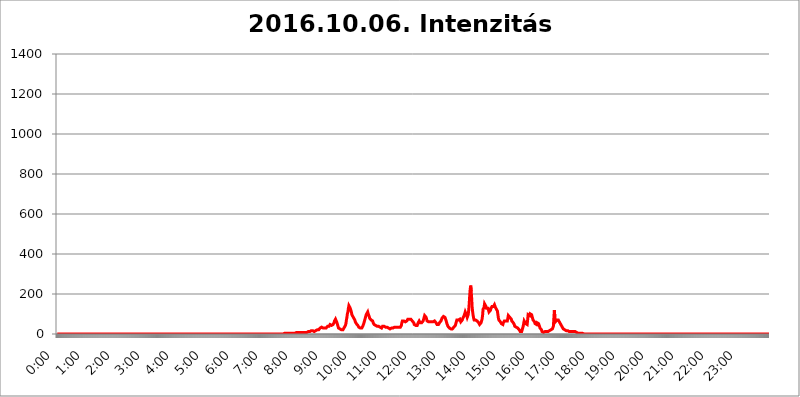
| Category | 2016.10.06. Intenzitás [W/m^2] |
|---|---|
| 0.0 | 0 |
| 0.0006944444444444445 | 0 |
| 0.001388888888888889 | 0 |
| 0.0020833333333333333 | 0 |
| 0.002777777777777778 | 0 |
| 0.003472222222222222 | 0 |
| 0.004166666666666667 | 0 |
| 0.004861111111111111 | 0 |
| 0.005555555555555556 | 0 |
| 0.0062499999999999995 | 0 |
| 0.006944444444444444 | 0 |
| 0.007638888888888889 | 0 |
| 0.008333333333333333 | 0 |
| 0.009027777777777779 | 0 |
| 0.009722222222222222 | 0 |
| 0.010416666666666666 | 0 |
| 0.011111111111111112 | 0 |
| 0.011805555555555555 | 0 |
| 0.012499999999999999 | 0 |
| 0.013194444444444444 | 0 |
| 0.013888888888888888 | 0 |
| 0.014583333333333332 | 0 |
| 0.015277777777777777 | 0 |
| 0.015972222222222224 | 0 |
| 0.016666666666666666 | 0 |
| 0.017361111111111112 | 0 |
| 0.018055555555555557 | 0 |
| 0.01875 | 0 |
| 0.019444444444444445 | 0 |
| 0.02013888888888889 | 0 |
| 0.020833333333333332 | 0 |
| 0.02152777777777778 | 0 |
| 0.022222222222222223 | 0 |
| 0.02291666666666667 | 0 |
| 0.02361111111111111 | 0 |
| 0.024305555555555556 | 0 |
| 0.024999999999999998 | 0 |
| 0.025694444444444447 | 0 |
| 0.02638888888888889 | 0 |
| 0.027083333333333334 | 0 |
| 0.027777777777777776 | 0 |
| 0.02847222222222222 | 0 |
| 0.029166666666666664 | 0 |
| 0.029861111111111113 | 0 |
| 0.030555555555555555 | 0 |
| 0.03125 | 0 |
| 0.03194444444444445 | 0 |
| 0.03263888888888889 | 0 |
| 0.03333333333333333 | 0 |
| 0.034027777777777775 | 0 |
| 0.034722222222222224 | 0 |
| 0.035416666666666666 | 0 |
| 0.036111111111111115 | 0 |
| 0.03680555555555556 | 0 |
| 0.0375 | 0 |
| 0.03819444444444444 | 0 |
| 0.03888888888888889 | 0 |
| 0.03958333333333333 | 0 |
| 0.04027777777777778 | 0 |
| 0.04097222222222222 | 0 |
| 0.041666666666666664 | 0 |
| 0.042361111111111106 | 0 |
| 0.04305555555555556 | 0 |
| 0.043750000000000004 | 0 |
| 0.044444444444444446 | 0 |
| 0.04513888888888889 | 0 |
| 0.04583333333333334 | 0 |
| 0.04652777777777778 | 0 |
| 0.04722222222222222 | 0 |
| 0.04791666666666666 | 0 |
| 0.04861111111111111 | 0 |
| 0.049305555555555554 | 0 |
| 0.049999999999999996 | 0 |
| 0.05069444444444445 | 0 |
| 0.051388888888888894 | 0 |
| 0.052083333333333336 | 0 |
| 0.05277777777777778 | 0 |
| 0.05347222222222222 | 0 |
| 0.05416666666666667 | 0 |
| 0.05486111111111111 | 0 |
| 0.05555555555555555 | 0 |
| 0.05625 | 0 |
| 0.05694444444444444 | 0 |
| 0.057638888888888885 | 0 |
| 0.05833333333333333 | 0 |
| 0.05902777777777778 | 0 |
| 0.059722222222222225 | 0 |
| 0.06041666666666667 | 0 |
| 0.061111111111111116 | 0 |
| 0.06180555555555556 | 0 |
| 0.0625 | 0 |
| 0.06319444444444444 | 0 |
| 0.06388888888888888 | 0 |
| 0.06458333333333334 | 0 |
| 0.06527777777777778 | 0 |
| 0.06597222222222222 | 0 |
| 0.06666666666666667 | 0 |
| 0.06736111111111111 | 0 |
| 0.06805555555555555 | 0 |
| 0.06874999999999999 | 0 |
| 0.06944444444444443 | 0 |
| 0.07013888888888889 | 0 |
| 0.07083333333333333 | 0 |
| 0.07152777777777779 | 0 |
| 0.07222222222222223 | 0 |
| 0.07291666666666667 | 0 |
| 0.07361111111111111 | 0 |
| 0.07430555555555556 | 0 |
| 0.075 | 0 |
| 0.07569444444444444 | 0 |
| 0.0763888888888889 | 0 |
| 0.07708333333333334 | 0 |
| 0.07777777777777778 | 0 |
| 0.07847222222222222 | 0 |
| 0.07916666666666666 | 0 |
| 0.0798611111111111 | 0 |
| 0.08055555555555556 | 0 |
| 0.08125 | 0 |
| 0.08194444444444444 | 0 |
| 0.08263888888888889 | 0 |
| 0.08333333333333333 | 0 |
| 0.08402777777777777 | 0 |
| 0.08472222222222221 | 0 |
| 0.08541666666666665 | 0 |
| 0.08611111111111112 | 0 |
| 0.08680555555555557 | 0 |
| 0.08750000000000001 | 0 |
| 0.08819444444444445 | 0 |
| 0.08888888888888889 | 0 |
| 0.08958333333333333 | 0 |
| 0.09027777777777778 | 0 |
| 0.09097222222222222 | 0 |
| 0.09166666666666667 | 0 |
| 0.09236111111111112 | 0 |
| 0.09305555555555556 | 0 |
| 0.09375 | 0 |
| 0.09444444444444444 | 0 |
| 0.09513888888888888 | 0 |
| 0.09583333333333333 | 0 |
| 0.09652777777777777 | 0 |
| 0.09722222222222222 | 0 |
| 0.09791666666666667 | 0 |
| 0.09861111111111111 | 0 |
| 0.09930555555555555 | 0 |
| 0.09999999999999999 | 0 |
| 0.10069444444444443 | 0 |
| 0.1013888888888889 | 0 |
| 0.10208333333333335 | 0 |
| 0.10277777777777779 | 0 |
| 0.10347222222222223 | 0 |
| 0.10416666666666667 | 0 |
| 0.10486111111111111 | 0 |
| 0.10555555555555556 | 0 |
| 0.10625 | 0 |
| 0.10694444444444444 | 0 |
| 0.1076388888888889 | 0 |
| 0.10833333333333334 | 0 |
| 0.10902777777777778 | 0 |
| 0.10972222222222222 | 0 |
| 0.1111111111111111 | 0 |
| 0.11180555555555556 | 0 |
| 0.11180555555555556 | 0 |
| 0.1125 | 0 |
| 0.11319444444444444 | 0 |
| 0.11388888888888889 | 0 |
| 0.11458333333333333 | 0 |
| 0.11527777777777777 | 0 |
| 0.11597222222222221 | 0 |
| 0.11666666666666665 | 0 |
| 0.1173611111111111 | 0 |
| 0.11805555555555557 | 0 |
| 0.11944444444444445 | 0 |
| 0.12013888888888889 | 0 |
| 0.12083333333333333 | 0 |
| 0.12152777777777778 | 0 |
| 0.12222222222222223 | 0 |
| 0.12291666666666667 | 0 |
| 0.12291666666666667 | 0 |
| 0.12361111111111112 | 0 |
| 0.12430555555555556 | 0 |
| 0.125 | 0 |
| 0.12569444444444444 | 0 |
| 0.12638888888888888 | 0 |
| 0.12708333333333333 | 0 |
| 0.16875 | 0 |
| 0.12847222222222224 | 0 |
| 0.12916666666666668 | 0 |
| 0.12986111111111112 | 0 |
| 0.13055555555555556 | 0 |
| 0.13125 | 0 |
| 0.13194444444444445 | 0 |
| 0.1326388888888889 | 0 |
| 0.13333333333333333 | 0 |
| 0.13402777777777777 | 0 |
| 0.13402777777777777 | 0 |
| 0.13472222222222222 | 0 |
| 0.13541666666666666 | 0 |
| 0.1361111111111111 | 0 |
| 0.13749999999999998 | 0 |
| 0.13819444444444443 | 0 |
| 0.1388888888888889 | 0 |
| 0.13958333333333334 | 0 |
| 0.14027777777777778 | 0 |
| 0.14097222222222222 | 0 |
| 0.14166666666666666 | 0 |
| 0.1423611111111111 | 0 |
| 0.14305555555555557 | 0 |
| 0.14375000000000002 | 0 |
| 0.14444444444444446 | 0 |
| 0.1451388888888889 | 0 |
| 0.1451388888888889 | 0 |
| 0.14652777777777778 | 0 |
| 0.14722222222222223 | 0 |
| 0.14791666666666667 | 0 |
| 0.1486111111111111 | 0 |
| 0.14930555555555555 | 0 |
| 0.15 | 0 |
| 0.15069444444444444 | 0 |
| 0.15138888888888888 | 0 |
| 0.15208333333333332 | 0 |
| 0.15277777777777776 | 0 |
| 0.15347222222222223 | 0 |
| 0.15416666666666667 | 0 |
| 0.15486111111111112 | 0 |
| 0.15555555555555556 | 0 |
| 0.15625 | 0 |
| 0.15694444444444444 | 0 |
| 0.15763888888888888 | 0 |
| 0.15833333333333333 | 0 |
| 0.15902777777777777 | 0 |
| 0.15972222222222224 | 0 |
| 0.16041666666666668 | 0 |
| 0.16111111111111112 | 0 |
| 0.16180555555555556 | 0 |
| 0.1625 | 0 |
| 0.16319444444444445 | 0 |
| 0.1638888888888889 | 0 |
| 0.16458333333333333 | 0 |
| 0.16527777777777777 | 0 |
| 0.16597222222222222 | 0 |
| 0.16666666666666666 | 0 |
| 0.1673611111111111 | 0 |
| 0.16805555555555554 | 0 |
| 0.16874999999999998 | 0 |
| 0.16944444444444443 | 0 |
| 0.17013888888888887 | 0 |
| 0.1708333333333333 | 0 |
| 0.17152777777777775 | 0 |
| 0.17222222222222225 | 0 |
| 0.1729166666666667 | 0 |
| 0.17361111111111113 | 0 |
| 0.17430555555555557 | 0 |
| 0.17500000000000002 | 0 |
| 0.17569444444444446 | 0 |
| 0.1763888888888889 | 0 |
| 0.17708333333333334 | 0 |
| 0.17777777777777778 | 0 |
| 0.17847222222222223 | 0 |
| 0.17916666666666667 | 0 |
| 0.1798611111111111 | 0 |
| 0.18055555555555555 | 0 |
| 0.18125 | 0 |
| 0.18194444444444444 | 0 |
| 0.1826388888888889 | 0 |
| 0.18333333333333335 | 0 |
| 0.1840277777777778 | 0 |
| 0.18472222222222223 | 0 |
| 0.18541666666666667 | 0 |
| 0.18611111111111112 | 0 |
| 0.18680555555555556 | 0 |
| 0.1875 | 0 |
| 0.18819444444444444 | 0 |
| 0.18888888888888888 | 0 |
| 0.18958333333333333 | 0 |
| 0.19027777777777777 | 0 |
| 0.1909722222222222 | 0 |
| 0.19166666666666665 | 0 |
| 0.19236111111111112 | 0 |
| 0.19305555555555554 | 0 |
| 0.19375 | 0 |
| 0.19444444444444445 | 0 |
| 0.1951388888888889 | 0 |
| 0.19583333333333333 | 0 |
| 0.19652777777777777 | 0 |
| 0.19722222222222222 | 0 |
| 0.19791666666666666 | 0 |
| 0.1986111111111111 | 0 |
| 0.19930555555555554 | 0 |
| 0.19999999999999998 | 0 |
| 0.20069444444444443 | 0 |
| 0.20138888888888887 | 0 |
| 0.2020833333333333 | 0 |
| 0.2027777777777778 | 0 |
| 0.2034722222222222 | 0 |
| 0.2041666666666667 | 0 |
| 0.20486111111111113 | 0 |
| 0.20555555555555557 | 0 |
| 0.20625000000000002 | 0 |
| 0.20694444444444446 | 0 |
| 0.2076388888888889 | 0 |
| 0.20833333333333334 | 0 |
| 0.20902777777777778 | 0 |
| 0.20972222222222223 | 0 |
| 0.21041666666666667 | 0 |
| 0.2111111111111111 | 0 |
| 0.21180555555555555 | 0 |
| 0.2125 | 0 |
| 0.21319444444444444 | 0 |
| 0.2138888888888889 | 0 |
| 0.21458333333333335 | 0 |
| 0.2152777777777778 | 0 |
| 0.21597222222222223 | 0 |
| 0.21666666666666667 | 0 |
| 0.21736111111111112 | 0 |
| 0.21805555555555556 | 0 |
| 0.21875 | 0 |
| 0.21944444444444444 | 0 |
| 0.22013888888888888 | 0 |
| 0.22083333333333333 | 0 |
| 0.22152777777777777 | 0 |
| 0.2222222222222222 | 0 |
| 0.22291666666666665 | 0 |
| 0.2236111111111111 | 0 |
| 0.22430555555555556 | 0 |
| 0.225 | 0 |
| 0.22569444444444445 | 0 |
| 0.2263888888888889 | 0 |
| 0.22708333333333333 | 0 |
| 0.22777777777777777 | 0 |
| 0.22847222222222222 | 0 |
| 0.22916666666666666 | 0 |
| 0.2298611111111111 | 0 |
| 0.23055555555555554 | 0 |
| 0.23124999999999998 | 0 |
| 0.23194444444444443 | 0 |
| 0.23263888888888887 | 0 |
| 0.2333333333333333 | 0 |
| 0.2340277777777778 | 0 |
| 0.2347222222222222 | 0 |
| 0.2354166666666667 | 0 |
| 0.23611111111111113 | 0 |
| 0.23680555555555557 | 0 |
| 0.23750000000000002 | 0 |
| 0.23819444444444446 | 0 |
| 0.2388888888888889 | 0 |
| 0.23958333333333334 | 0 |
| 0.24027777777777778 | 0 |
| 0.24097222222222223 | 0 |
| 0.24166666666666667 | 0 |
| 0.2423611111111111 | 0 |
| 0.24305555555555555 | 0 |
| 0.24375 | 0 |
| 0.24444444444444446 | 0 |
| 0.24513888888888888 | 0 |
| 0.24583333333333335 | 0 |
| 0.2465277777777778 | 0 |
| 0.24722222222222223 | 0 |
| 0.24791666666666667 | 0 |
| 0.24861111111111112 | 0 |
| 0.24930555555555556 | 0 |
| 0.25 | 0 |
| 0.25069444444444444 | 0 |
| 0.2513888888888889 | 0 |
| 0.2520833333333333 | 0 |
| 0.25277777777777777 | 0 |
| 0.2534722222222222 | 0 |
| 0.25416666666666665 | 0 |
| 0.2548611111111111 | 0 |
| 0.2555555555555556 | 0 |
| 0.25625000000000003 | 0 |
| 0.2569444444444445 | 0 |
| 0.2576388888888889 | 0 |
| 0.25833333333333336 | 0 |
| 0.2590277777777778 | 0 |
| 0.25972222222222224 | 0 |
| 0.2604166666666667 | 0 |
| 0.2611111111111111 | 0 |
| 0.26180555555555557 | 0 |
| 0.2625 | 0 |
| 0.26319444444444445 | 0 |
| 0.2638888888888889 | 0 |
| 0.26458333333333334 | 0 |
| 0.2652777777777778 | 0 |
| 0.2659722222222222 | 0 |
| 0.26666666666666666 | 0 |
| 0.2673611111111111 | 0 |
| 0.26805555555555555 | 0 |
| 0.26875 | 0 |
| 0.26944444444444443 | 0 |
| 0.2701388888888889 | 0 |
| 0.2708333333333333 | 0 |
| 0.27152777777777776 | 0 |
| 0.2722222222222222 | 0 |
| 0.27291666666666664 | 0 |
| 0.2736111111111111 | 0 |
| 0.2743055555555555 | 0 |
| 0.27499999999999997 | 0 |
| 0.27569444444444446 | 0 |
| 0.27638888888888885 | 0 |
| 0.27708333333333335 | 0 |
| 0.2777777777777778 | 0 |
| 0.27847222222222223 | 0 |
| 0.2791666666666667 | 0 |
| 0.2798611111111111 | 0 |
| 0.28055555555555556 | 0 |
| 0.28125 | 0 |
| 0.28194444444444444 | 0 |
| 0.2826388888888889 | 0 |
| 0.2833333333333333 | 0 |
| 0.28402777777777777 | 0 |
| 0.2847222222222222 | 0 |
| 0.28541666666666665 | 0 |
| 0.28611111111111115 | 0 |
| 0.28680555555555554 | 0 |
| 0.28750000000000003 | 0 |
| 0.2881944444444445 | 0 |
| 0.2888888888888889 | 0 |
| 0.28958333333333336 | 0 |
| 0.2902777777777778 | 0 |
| 0.29097222222222224 | 0 |
| 0.2916666666666667 | 0 |
| 0.2923611111111111 | 0 |
| 0.29305555555555557 | 0 |
| 0.29375 | 0 |
| 0.29444444444444445 | 0 |
| 0.2951388888888889 | 0 |
| 0.29583333333333334 | 0 |
| 0.2965277777777778 | 0 |
| 0.2972222222222222 | 0 |
| 0.29791666666666666 | 0 |
| 0.2986111111111111 | 0 |
| 0.29930555555555555 | 0 |
| 0.3 | 0 |
| 0.30069444444444443 | 0 |
| 0.3013888888888889 | 0 |
| 0.3020833333333333 | 0 |
| 0.30277777777777776 | 0 |
| 0.3034722222222222 | 0 |
| 0.30416666666666664 | 0 |
| 0.3048611111111111 | 0 |
| 0.3055555555555555 | 0 |
| 0.30624999999999997 | 0 |
| 0.3069444444444444 | 0 |
| 0.3076388888888889 | 0 |
| 0.30833333333333335 | 0 |
| 0.3090277777777778 | 3.525 |
| 0.30972222222222223 | 0 |
| 0.3104166666666667 | 0 |
| 0.3111111111111111 | 0 |
| 0.31180555555555556 | 0 |
| 0.3125 | 0 |
| 0.31319444444444444 | 0 |
| 0.3138888888888889 | 0 |
| 0.3145833333333333 | 0 |
| 0.31527777777777777 | 3.525 |
| 0.3159722222222222 | 3.525 |
| 0.31666666666666665 | 0 |
| 0.31736111111111115 | 3.525 |
| 0.31805555555555554 | 3.525 |
| 0.31875000000000003 | 3.525 |
| 0.3194444444444445 | 3.525 |
| 0.3201388888888889 | 3.525 |
| 0.32083333333333336 | 3.525 |
| 0.3215277777777778 | 3.525 |
| 0.32222222222222224 | 3.525 |
| 0.3229166666666667 | 3.525 |
| 0.3236111111111111 | 3.525 |
| 0.32430555555555557 | 3.525 |
| 0.325 | 3.525 |
| 0.32569444444444445 | 3.525 |
| 0.3263888888888889 | 3.525 |
| 0.32708333333333334 | 3.525 |
| 0.3277777777777778 | 3.525 |
| 0.3284722222222222 | 3.525 |
| 0.32916666666666666 | 3.525 |
| 0.3298611111111111 | 3.525 |
| 0.33055555555555555 | 3.525 |
| 0.33125 | 3.525 |
| 0.33194444444444443 | 3.525 |
| 0.3326388888888889 | 3.525 |
| 0.3333333333333333 | 3.525 |
| 0.3340277777777778 | 3.525 |
| 0.3347222222222222 | 7.887 |
| 0.3354166666666667 | 7.887 |
| 0.3361111111111111 | 7.887 |
| 0.3368055555555556 | 3.525 |
| 0.33749999999999997 | 7.887 |
| 0.33819444444444446 | 7.887 |
| 0.33888888888888885 | 7.887 |
| 0.33958333333333335 | 7.887 |
| 0.34027777777777773 | 7.887 |
| 0.34097222222222223 | 7.887 |
| 0.3416666666666666 | 7.887 |
| 0.3423611111111111 | 7.887 |
| 0.3430555555555555 | 7.887 |
| 0.34375 | 7.887 |
| 0.3444444444444445 | 7.887 |
| 0.3451388888888889 | 7.887 |
| 0.3458333333333334 | 7.887 |
| 0.34652777777777777 | 7.887 |
| 0.34722222222222227 | 7.887 |
| 0.34791666666666665 | 7.887 |
| 0.34861111111111115 | 7.887 |
| 0.34930555555555554 | 7.887 |
| 0.35000000000000003 | 7.887 |
| 0.3506944444444444 | 7.887 |
| 0.3513888888888889 | 12.257 |
| 0.3520833333333333 | 12.257 |
| 0.3527777777777778 | 12.257 |
| 0.3534722222222222 | 12.257 |
| 0.3541666666666667 | 12.257 |
| 0.3548611111111111 | 12.257 |
| 0.35555555555555557 | 16.636 |
| 0.35625 | 16.636 |
| 0.35694444444444445 | 16.636 |
| 0.3576388888888889 | 16.636 |
| 0.35833333333333334 | 16.636 |
| 0.3590277777777778 | 16.636 |
| 0.3597222222222222 | 12.257 |
| 0.36041666666666666 | 12.257 |
| 0.3611111111111111 | 12.257 |
| 0.36180555555555555 | 12.257 |
| 0.3625 | 16.636 |
| 0.36319444444444443 | 16.636 |
| 0.3638888888888889 | 21.024 |
| 0.3645833333333333 | 21.024 |
| 0.3652777777777778 | 21.024 |
| 0.3659722222222222 | 21.024 |
| 0.3666666666666667 | 21.024 |
| 0.3673611111111111 | 25.419 |
| 0.3680555555555556 | 25.419 |
| 0.36874999999999997 | 29.823 |
| 0.36944444444444446 | 29.823 |
| 0.37013888888888885 | 29.823 |
| 0.37083333333333335 | 34.234 |
| 0.37152777777777773 | 34.234 |
| 0.37222222222222223 | 29.823 |
| 0.3729166666666666 | 29.823 |
| 0.3736111111111111 | 25.419 |
| 0.3743055555555555 | 29.823 |
| 0.375 | 29.823 |
| 0.3756944444444445 | 29.823 |
| 0.3763888888888889 | 29.823 |
| 0.3770833333333334 | 29.823 |
| 0.37777777777777777 | 29.823 |
| 0.37847222222222227 | 34.234 |
| 0.37916666666666665 | 38.653 |
| 0.37986111111111115 | 38.653 |
| 0.38055555555555554 | 38.653 |
| 0.38125000000000003 | 38.653 |
| 0.3819444444444444 | 43.079 |
| 0.3826388888888889 | 47.511 |
| 0.3833333333333333 | 47.511 |
| 0.3840277777777778 | 47.511 |
| 0.3847222222222222 | 43.079 |
| 0.3854166666666667 | 43.079 |
| 0.3861111111111111 | 47.511 |
| 0.38680555555555557 | 47.511 |
| 0.3875 | 47.511 |
| 0.38819444444444445 | 56.398 |
| 0.3888888888888889 | 65.31 |
| 0.38958333333333334 | 69.775 |
| 0.3902777777777778 | 74.246 |
| 0.3909722222222222 | 74.246 |
| 0.39166666666666666 | 69.775 |
| 0.3923611111111111 | 56.398 |
| 0.39305555555555555 | 47.511 |
| 0.39375 | 38.653 |
| 0.39444444444444443 | 29.823 |
| 0.3951388888888889 | 29.823 |
| 0.3958333333333333 | 29.823 |
| 0.3965277777777778 | 25.419 |
| 0.3972222222222222 | 25.419 |
| 0.3979166666666667 | 25.419 |
| 0.3986111111111111 | 21.024 |
| 0.3993055555555556 | 21.024 |
| 0.39999999999999997 | 21.024 |
| 0.40069444444444446 | 21.024 |
| 0.40138888888888885 | 25.419 |
| 0.40208333333333335 | 29.823 |
| 0.40277777777777773 | 29.823 |
| 0.40347222222222223 | 34.234 |
| 0.4041666666666666 | 43.079 |
| 0.4048611111111111 | 51.951 |
| 0.4055555555555555 | 69.775 |
| 0.40625 | 83.205 |
| 0.4069444444444445 | 101.184 |
| 0.4076388888888889 | 110.201 |
| 0.4083333333333334 | 128.284 |
| 0.40902777777777777 | 141.884 |
| 0.40972222222222227 | 146.423 |
| 0.41041666666666665 | 132.814 |
| 0.41111111111111115 | 128.284 |
| 0.41180555555555554 | 119.235 |
| 0.41250000000000003 | 110.201 |
| 0.4131944444444444 | 96.682 |
| 0.4138888888888889 | 92.184 |
| 0.4145833333333333 | 87.692 |
| 0.4152777777777778 | 83.205 |
| 0.4159722222222222 | 78.722 |
| 0.4166666666666667 | 74.246 |
| 0.4173611111111111 | 69.775 |
| 0.41805555555555557 | 60.85 |
| 0.41875 | 56.398 |
| 0.41944444444444445 | 51.951 |
| 0.4201388888888889 | 51.951 |
| 0.42083333333333334 | 47.511 |
| 0.4215277777777778 | 43.079 |
| 0.4222222222222222 | 38.653 |
| 0.42291666666666666 | 34.234 |
| 0.4236111111111111 | 29.823 |
| 0.42430555555555555 | 29.823 |
| 0.425 | 29.823 |
| 0.42569444444444443 | 29.823 |
| 0.4263888888888889 | 29.823 |
| 0.4270833333333333 | 29.823 |
| 0.4277777777777778 | 29.823 |
| 0.4284722222222222 | 38.653 |
| 0.4291666666666667 | 43.079 |
| 0.4298611111111111 | 51.951 |
| 0.4305555555555556 | 60.85 |
| 0.43124999999999997 | 69.775 |
| 0.43194444444444446 | 78.722 |
| 0.43263888888888885 | 87.692 |
| 0.43333333333333335 | 96.682 |
| 0.43402777777777773 | 96.682 |
| 0.43472222222222223 | 101.184 |
| 0.4354166666666666 | 110.201 |
| 0.4361111111111111 | 101.184 |
| 0.4368055555555555 | 96.682 |
| 0.4375 | 87.692 |
| 0.4381944444444445 | 78.722 |
| 0.4388888888888889 | 74.246 |
| 0.4395833333333334 | 74.246 |
| 0.44027777777777777 | 69.775 |
| 0.44097222222222227 | 69.775 |
| 0.44166666666666665 | 65.31 |
| 0.44236111111111115 | 65.31 |
| 0.44305555555555554 | 56.398 |
| 0.44375000000000003 | 51.951 |
| 0.4444444444444444 | 47.511 |
| 0.4451388888888889 | 47.511 |
| 0.4458333333333333 | 47.511 |
| 0.4465277777777778 | 43.079 |
| 0.4472222222222222 | 38.653 |
| 0.4479166666666667 | 38.653 |
| 0.4486111111111111 | 38.653 |
| 0.44930555555555557 | 34.234 |
| 0.45 | 38.653 |
| 0.45069444444444445 | 38.653 |
| 0.4513888888888889 | 38.653 |
| 0.45208333333333334 | 34.234 |
| 0.4527777777777778 | 34.234 |
| 0.4534722222222222 | 29.823 |
| 0.45416666666666666 | 29.823 |
| 0.4548611111111111 | 29.823 |
| 0.45555555555555555 | 34.234 |
| 0.45625 | 38.653 |
| 0.45694444444444443 | 38.653 |
| 0.4576388888888889 | 43.079 |
| 0.4583333333333333 | 38.653 |
| 0.4590277777777778 | 38.653 |
| 0.4597222222222222 | 34.234 |
| 0.4604166666666667 | 34.234 |
| 0.4611111111111111 | 34.234 |
| 0.4618055555555556 | 34.234 |
| 0.46249999999999997 | 34.234 |
| 0.46319444444444446 | 29.823 |
| 0.46388888888888885 | 29.823 |
| 0.46458333333333335 | 29.823 |
| 0.46527777777777773 | 25.419 |
| 0.46597222222222223 | 25.419 |
| 0.4666666666666666 | 25.419 |
| 0.4673611111111111 | 25.419 |
| 0.4680555555555555 | 29.823 |
| 0.46875 | 29.823 |
| 0.4694444444444445 | 29.823 |
| 0.4701388888888889 | 29.823 |
| 0.4708333333333334 | 29.823 |
| 0.47152777777777777 | 34.234 |
| 0.47222222222222227 | 34.234 |
| 0.47291666666666665 | 34.234 |
| 0.47361111111111115 | 34.234 |
| 0.47430555555555554 | 34.234 |
| 0.47500000000000003 | 34.234 |
| 0.4756944444444444 | 34.234 |
| 0.4763888888888889 | 34.234 |
| 0.4770833333333333 | 34.234 |
| 0.4777777777777778 | 34.234 |
| 0.4784722222222222 | 34.234 |
| 0.4791666666666667 | 34.234 |
| 0.4798611111111111 | 34.234 |
| 0.48055555555555557 | 34.234 |
| 0.48125 | 34.234 |
| 0.48194444444444445 | 38.653 |
| 0.4826388888888889 | 43.079 |
| 0.48333333333333334 | 56.398 |
| 0.4840277777777778 | 65.31 |
| 0.4847222222222222 | 69.775 |
| 0.48541666666666666 | 69.775 |
| 0.4861111111111111 | 65.31 |
| 0.48680555555555555 | 60.85 |
| 0.4875 | 60.85 |
| 0.48819444444444443 | 60.85 |
| 0.4888888888888889 | 60.85 |
| 0.4895833333333333 | 60.85 |
| 0.4902777777777778 | 65.31 |
| 0.4909722222222222 | 69.775 |
| 0.4916666666666667 | 74.246 |
| 0.4923611111111111 | 74.246 |
| 0.4930555555555556 | 74.246 |
| 0.49374999999999997 | 74.246 |
| 0.49444444444444446 | 78.722 |
| 0.49513888888888885 | 74.246 |
| 0.49583333333333335 | 74.246 |
| 0.49652777777777773 | 69.775 |
| 0.49722222222222223 | 69.775 |
| 0.4979166666666666 | 65.31 |
| 0.4986111111111111 | 65.31 |
| 0.4993055555555555 | 60.85 |
| 0.5 | 56.398 |
| 0.5006944444444444 | 47.511 |
| 0.5013888888888889 | 43.079 |
| 0.5020833333333333 | 43.079 |
| 0.5027777777777778 | 43.079 |
| 0.5034722222222222 | 38.653 |
| 0.5041666666666667 | 38.653 |
| 0.5048611111111111 | 43.079 |
| 0.5055555555555555 | 47.511 |
| 0.50625 | 56.398 |
| 0.5069444444444444 | 60.85 |
| 0.5076388888888889 | 65.31 |
| 0.5083333333333333 | 60.85 |
| 0.5090277777777777 | 56.398 |
| 0.5097222222222222 | 51.951 |
| 0.5104166666666666 | 51.951 |
| 0.5111111111111112 | 56.398 |
| 0.5118055555555555 | 56.398 |
| 0.5125000000000001 | 60.85 |
| 0.5131944444444444 | 65.31 |
| 0.513888888888889 | 74.246 |
| 0.5145833333333333 | 83.205 |
| 0.5152777777777778 | 92.184 |
| 0.5159722222222222 | 92.184 |
| 0.5166666666666667 | 87.692 |
| 0.517361111111111 | 83.205 |
| 0.5180555555555556 | 74.246 |
| 0.5187499999999999 | 65.31 |
| 0.5194444444444445 | 60.85 |
| 0.5201388888888888 | 60.85 |
| 0.5208333333333334 | 60.85 |
| 0.5215277777777778 | 60.85 |
| 0.5222222222222223 | 60.85 |
| 0.5229166666666667 | 60.85 |
| 0.5236111111111111 | 60.85 |
| 0.5243055555555556 | 60.85 |
| 0.525 | 60.85 |
| 0.5256944444444445 | 60.85 |
| 0.5263888888888889 | 60.85 |
| 0.5270833333333333 | 60.85 |
| 0.5277777777777778 | 60.85 |
| 0.5284722222222222 | 65.31 |
| 0.5291666666666667 | 65.31 |
| 0.5298611111111111 | 65.31 |
| 0.5305555555555556 | 60.85 |
| 0.53125 | 56.398 |
| 0.5319444444444444 | 56.398 |
| 0.5326388888888889 | 47.511 |
| 0.5333333333333333 | 43.079 |
| 0.5340277777777778 | 43.079 |
| 0.5347222222222222 | 47.511 |
| 0.5354166666666667 | 51.951 |
| 0.5361111111111111 | 56.398 |
| 0.5368055555555555 | 56.398 |
| 0.5375 | 56.398 |
| 0.5381944444444444 | 65.31 |
| 0.5388888888888889 | 69.775 |
| 0.5395833333333333 | 78.722 |
| 0.5402777777777777 | 83.205 |
| 0.5409722222222222 | 83.205 |
| 0.5416666666666666 | 87.692 |
| 0.5423611111111112 | 92.184 |
| 0.5430555555555555 | 87.692 |
| 0.5437500000000001 | 83.205 |
| 0.5444444444444444 | 78.722 |
| 0.545138888888889 | 69.775 |
| 0.5458333333333333 | 60.85 |
| 0.5465277777777778 | 51.951 |
| 0.5472222222222222 | 47.511 |
| 0.5479166666666667 | 38.653 |
| 0.548611111111111 | 34.234 |
| 0.5493055555555556 | 34.234 |
| 0.5499999999999999 | 29.823 |
| 0.5506944444444445 | 25.419 |
| 0.5513888888888888 | 25.419 |
| 0.5520833333333334 | 25.419 |
| 0.5527777777777778 | 25.419 |
| 0.5534722222222223 | 25.419 |
| 0.5541666666666667 | 25.419 |
| 0.5548611111111111 | 25.419 |
| 0.5555555555555556 | 29.823 |
| 0.55625 | 34.234 |
| 0.5569444444444445 | 38.653 |
| 0.5576388888888889 | 38.653 |
| 0.5583333333333333 | 43.079 |
| 0.5590277777777778 | 51.951 |
| 0.5597222222222222 | 60.85 |
| 0.5604166666666667 | 69.775 |
| 0.5611111111111111 | 65.31 |
| 0.5618055555555556 | 65.31 |
| 0.5625 | 69.775 |
| 0.5631944444444444 | 74.246 |
| 0.5638888888888889 | 74.246 |
| 0.5645833333333333 | 74.246 |
| 0.5652777777777778 | 69.775 |
| 0.5659722222222222 | 60.85 |
| 0.5666666666666667 | 56.398 |
| 0.5673611111111111 | 60.85 |
| 0.5680555555555555 | 69.775 |
| 0.56875 | 78.722 |
| 0.5694444444444444 | 83.205 |
| 0.5701388888888889 | 87.692 |
| 0.5708333333333333 | 92.184 |
| 0.5715277777777777 | 101.184 |
| 0.5722222222222222 | 110.201 |
| 0.5729166666666666 | 114.716 |
| 0.5736111111111112 | 105.69 |
| 0.5743055555555555 | 92.184 |
| 0.5750000000000001 | 83.205 |
| 0.5756944444444444 | 83.205 |
| 0.576388888888889 | 96.682 |
| 0.5770833333333333 | 119.235 |
| 0.5777777777777778 | 150.964 |
| 0.5784722222222222 | 191.937 |
| 0.5791666666666667 | 223.873 |
| 0.579861111111111 | 242.127 |
| 0.5805555555555556 | 214.746 |
| 0.5812499999999999 | 178.264 |
| 0.5819444444444445 | 132.814 |
| 0.5826388888888888 | 110.201 |
| 0.5833333333333334 | 92.184 |
| 0.5840277777777778 | 78.722 |
| 0.5847222222222223 | 69.775 |
| 0.5854166666666667 | 65.31 |
| 0.5861111111111111 | 65.31 |
| 0.5868055555555556 | 69.775 |
| 0.5875 | 69.775 |
| 0.5881944444444445 | 69.775 |
| 0.5888888888888889 | 65.31 |
| 0.5895833333333333 | 65.31 |
| 0.5902777777777778 | 60.85 |
| 0.5909722222222222 | 56.398 |
| 0.5916666666666667 | 51.951 |
| 0.5923611111111111 | 47.511 |
| 0.5930555555555556 | 47.511 |
| 0.59375 | 51.951 |
| 0.5944444444444444 | 56.398 |
| 0.5951388888888889 | 65.31 |
| 0.5958333333333333 | 74.246 |
| 0.5965277777777778 | 92.184 |
| 0.5972222222222222 | 123.758 |
| 0.5979166666666667 | 119.235 |
| 0.5986111111111111 | 132.814 |
| 0.5993055555555555 | 150.964 |
| 0.6 | 155.509 |
| 0.6006944444444444 | 146.423 |
| 0.6013888888888889 | 137.347 |
| 0.6020833333333333 | 128.284 |
| 0.6027777777777777 | 123.758 |
| 0.6034722222222222 | 123.758 |
| 0.6041666666666666 | 128.284 |
| 0.6048611111111112 | 119.235 |
| 0.6055555555555555 | 110.201 |
| 0.6062500000000001 | 110.201 |
| 0.6069444444444444 | 114.716 |
| 0.607638888888889 | 119.235 |
| 0.6083333333333333 | 128.284 |
| 0.6090277777777778 | 132.814 |
| 0.6097222222222222 | 137.347 |
| 0.6104166666666667 | 137.347 |
| 0.611111111111111 | 132.814 |
| 0.6118055555555556 | 137.347 |
| 0.6124999999999999 | 141.884 |
| 0.6131944444444445 | 146.423 |
| 0.6138888888888888 | 141.884 |
| 0.6145833333333334 | 132.814 |
| 0.6152777777777778 | 128.284 |
| 0.6159722222222223 | 123.758 |
| 0.6166666666666667 | 119.235 |
| 0.6173611111111111 | 114.716 |
| 0.6180555555555556 | 96.682 |
| 0.61875 | 78.722 |
| 0.6194444444444445 | 69.775 |
| 0.6201388888888889 | 65.31 |
| 0.6208333333333333 | 65.31 |
| 0.6215277777777778 | 60.85 |
| 0.6222222222222222 | 56.398 |
| 0.6229166666666667 | 51.951 |
| 0.6236111111111111 | 47.511 |
| 0.6243055555555556 | 47.511 |
| 0.625 | 47.511 |
| 0.6256944444444444 | 56.398 |
| 0.6263888888888889 | 60.85 |
| 0.6270833333333333 | 65.31 |
| 0.6277777777777778 | 65.31 |
| 0.6284722222222222 | 65.31 |
| 0.6291666666666667 | 65.31 |
| 0.6298611111111111 | 60.85 |
| 0.6305555555555555 | 60.85 |
| 0.63125 | 65.31 |
| 0.6319444444444444 | 78.722 |
| 0.6326388888888889 | 92.184 |
| 0.6333333333333333 | 96.682 |
| 0.6340277777777777 | 92.184 |
| 0.6347222222222222 | 83.205 |
| 0.6354166666666666 | 83.205 |
| 0.6361111111111112 | 78.722 |
| 0.6368055555555555 | 74.246 |
| 0.6375000000000001 | 65.31 |
| 0.6381944444444444 | 65.31 |
| 0.638888888888889 | 60.85 |
| 0.6395833333333333 | 56.398 |
| 0.6402777777777778 | 51.951 |
| 0.6409722222222222 | 47.511 |
| 0.6416666666666667 | 38.653 |
| 0.642361111111111 | 34.234 |
| 0.6430555555555556 | 34.234 |
| 0.6437499999999999 | 34.234 |
| 0.6444444444444445 | 29.823 |
| 0.6451388888888888 | 29.823 |
| 0.6458333333333334 | 29.823 |
| 0.6465277777777778 | 25.419 |
| 0.6472222222222223 | 25.419 |
| 0.6479166666666667 | 21.024 |
| 0.6486111111111111 | 16.636 |
| 0.6493055555555556 | 12.257 |
| 0.65 | 12.257 |
| 0.6506944444444445 | 12.257 |
| 0.6513888888888889 | 12.257 |
| 0.6520833333333333 | 21.024 |
| 0.6527777777777778 | 29.823 |
| 0.6534722222222222 | 38.653 |
| 0.6541666666666667 | 51.951 |
| 0.6548611111111111 | 65.31 |
| 0.6555555555555556 | 65.31 |
| 0.65625 | 60.85 |
| 0.6569444444444444 | 51.951 |
| 0.6576388888888889 | 47.511 |
| 0.6583333333333333 | 47.511 |
| 0.6590277777777778 | 47.511 |
| 0.6597222222222222 | 69.775 |
| 0.6604166666666667 | 96.682 |
| 0.6611111111111111 | 96.682 |
| 0.6618055555555555 | 92.184 |
| 0.6625 | 92.184 |
| 0.6631944444444444 | 101.184 |
| 0.6638888888888889 | 101.184 |
| 0.6645833333333333 | 101.184 |
| 0.6652777777777777 | 96.682 |
| 0.6659722222222222 | 87.692 |
| 0.6666666666666666 | 78.722 |
| 0.6673611111111111 | 69.775 |
| 0.6680555555555556 | 69.775 |
| 0.6687500000000001 | 65.31 |
| 0.6694444444444444 | 60.85 |
| 0.6701388888888888 | 51.951 |
| 0.6708333333333334 | 47.511 |
| 0.6715277777777778 | 47.511 |
| 0.6722222222222222 | 47.511 |
| 0.6729166666666666 | 56.398 |
| 0.6736111111111112 | 56.398 |
| 0.6743055555555556 | 56.398 |
| 0.6749999999999999 | 51.951 |
| 0.6756944444444444 | 47.511 |
| 0.6763888888888889 | 38.653 |
| 0.6770833333333334 | 29.823 |
| 0.6777777777777777 | 29.823 |
| 0.6784722222222223 | 25.419 |
| 0.6791666666666667 | 21.024 |
| 0.6798611111111111 | 12.257 |
| 0.6805555555555555 | 12.257 |
| 0.68125 | 7.887 |
| 0.6819444444444445 | 7.887 |
| 0.6826388888888889 | 7.887 |
| 0.6833333333333332 | 12.257 |
| 0.6840277777777778 | 12.257 |
| 0.6847222222222222 | 12.257 |
| 0.6854166666666667 | 12.257 |
| 0.686111111111111 | 12.257 |
| 0.6868055555555556 | 12.257 |
| 0.6875 | 12.257 |
| 0.6881944444444444 | 12.257 |
| 0.688888888888889 | 12.257 |
| 0.6895833333333333 | 12.257 |
| 0.6902777777777778 | 16.636 |
| 0.6909722222222222 | 16.636 |
| 0.6916666666666668 | 16.636 |
| 0.6923611111111111 | 21.024 |
| 0.6930555555555555 | 21.024 |
| 0.69375 | 25.419 |
| 0.6944444444444445 | 25.419 |
| 0.6951388888888889 | 29.823 |
| 0.6958333333333333 | 38.653 |
| 0.6965277777777777 | 78.722 |
| 0.6972222222222223 | 119.235 |
| 0.6979166666666666 | 83.205 |
| 0.6986111111111111 | 60.85 |
| 0.6993055555555556 | 60.85 |
| 0.7000000000000001 | 65.31 |
| 0.7006944444444444 | 69.775 |
| 0.7013888888888888 | 69.775 |
| 0.7020833333333334 | 69.775 |
| 0.7027777777777778 | 69.775 |
| 0.7034722222222222 | 65.31 |
| 0.7041666666666666 | 60.85 |
| 0.7048611111111112 | 56.398 |
| 0.7055555555555556 | 51.951 |
| 0.7062499999999999 | 47.511 |
| 0.7069444444444444 | 43.079 |
| 0.7076388888888889 | 38.653 |
| 0.7083333333333334 | 34.234 |
| 0.7090277777777777 | 29.823 |
| 0.7097222222222223 | 25.419 |
| 0.7104166666666667 | 21.024 |
| 0.7111111111111111 | 21.024 |
| 0.7118055555555555 | 21.024 |
| 0.7125 | 16.636 |
| 0.7131944444444445 | 16.636 |
| 0.7138888888888889 | 16.636 |
| 0.7145833333333332 | 21.024 |
| 0.7152777777777778 | 16.636 |
| 0.7159722222222222 | 16.636 |
| 0.7166666666666667 | 16.636 |
| 0.717361111111111 | 16.636 |
| 0.7180555555555556 | 12.257 |
| 0.71875 | 12.257 |
| 0.7194444444444444 | 12.257 |
| 0.720138888888889 | 12.257 |
| 0.7208333333333333 | 12.257 |
| 0.7215277777777778 | 12.257 |
| 0.7222222222222222 | 12.257 |
| 0.7229166666666668 | 12.257 |
| 0.7236111111111111 | 12.257 |
| 0.7243055555555555 | 12.257 |
| 0.725 | 12.257 |
| 0.7256944444444445 | 12.257 |
| 0.7263888888888889 | 12.257 |
| 0.7270833333333333 | 12.257 |
| 0.7277777777777777 | 7.887 |
| 0.7284722222222223 | 7.887 |
| 0.7291666666666666 | 7.887 |
| 0.7298611111111111 | 7.887 |
| 0.7305555555555556 | 3.525 |
| 0.7312500000000001 | 3.525 |
| 0.7319444444444444 | 3.525 |
| 0.7326388888888888 | 3.525 |
| 0.7333333333333334 | 3.525 |
| 0.7340277777777778 | 3.525 |
| 0.7347222222222222 | 3.525 |
| 0.7354166666666666 | 3.525 |
| 0.7361111111111112 | 3.525 |
| 0.7368055555555556 | 3.525 |
| 0.7374999999999999 | 3.525 |
| 0.7381944444444444 | 3.525 |
| 0.7388888888888889 | 0 |
| 0.7395833333333334 | 0 |
| 0.7402777777777777 | 0 |
| 0.7409722222222223 | 0 |
| 0.7416666666666667 | 0 |
| 0.7423611111111111 | 0 |
| 0.7430555555555555 | 0 |
| 0.74375 | 0 |
| 0.7444444444444445 | 0 |
| 0.7451388888888889 | 0 |
| 0.7458333333333332 | 0 |
| 0.7465277777777778 | 0 |
| 0.7472222222222222 | 0 |
| 0.7479166666666667 | 0 |
| 0.748611111111111 | 0 |
| 0.7493055555555556 | 0 |
| 0.75 | 0 |
| 0.7506944444444444 | 0 |
| 0.751388888888889 | 0 |
| 0.7520833333333333 | 0 |
| 0.7527777777777778 | 0 |
| 0.7534722222222222 | 0 |
| 0.7541666666666668 | 0 |
| 0.7548611111111111 | 0 |
| 0.7555555555555555 | 0 |
| 0.75625 | 0 |
| 0.7569444444444445 | 0 |
| 0.7576388888888889 | 0 |
| 0.7583333333333333 | 0 |
| 0.7590277777777777 | 0 |
| 0.7597222222222223 | 0 |
| 0.7604166666666666 | 0 |
| 0.7611111111111111 | 0 |
| 0.7618055555555556 | 0 |
| 0.7625000000000001 | 0 |
| 0.7631944444444444 | 0 |
| 0.7638888888888888 | 0 |
| 0.7645833333333334 | 0 |
| 0.7652777777777778 | 0 |
| 0.7659722222222222 | 0 |
| 0.7666666666666666 | 0 |
| 0.7673611111111112 | 0 |
| 0.7680555555555556 | 0 |
| 0.7687499999999999 | 0 |
| 0.7694444444444444 | 0 |
| 0.7701388888888889 | 0 |
| 0.7708333333333334 | 0 |
| 0.7715277777777777 | 0 |
| 0.7722222222222223 | 0 |
| 0.7729166666666667 | 0 |
| 0.7736111111111111 | 0 |
| 0.7743055555555555 | 0 |
| 0.775 | 0 |
| 0.7756944444444445 | 0 |
| 0.7763888888888889 | 0 |
| 0.7770833333333332 | 0 |
| 0.7777777777777778 | 0 |
| 0.7784722222222222 | 0 |
| 0.7791666666666667 | 0 |
| 0.779861111111111 | 0 |
| 0.7805555555555556 | 0 |
| 0.78125 | 0 |
| 0.7819444444444444 | 0 |
| 0.782638888888889 | 0 |
| 0.7833333333333333 | 0 |
| 0.7840277777777778 | 0 |
| 0.7847222222222222 | 0 |
| 0.7854166666666668 | 0 |
| 0.7861111111111111 | 0 |
| 0.7868055555555555 | 0 |
| 0.7875 | 0 |
| 0.7881944444444445 | 0 |
| 0.7888888888888889 | 0 |
| 0.7895833333333333 | 0 |
| 0.7902777777777777 | 0 |
| 0.7909722222222223 | 0 |
| 0.7916666666666666 | 0 |
| 0.7923611111111111 | 0 |
| 0.7930555555555556 | 0 |
| 0.7937500000000001 | 0 |
| 0.7944444444444444 | 0 |
| 0.7951388888888888 | 0 |
| 0.7958333333333334 | 0 |
| 0.7965277777777778 | 0 |
| 0.7972222222222222 | 0 |
| 0.7979166666666666 | 0 |
| 0.7986111111111112 | 0 |
| 0.7993055555555556 | 0 |
| 0.7999999999999999 | 0 |
| 0.8006944444444444 | 0 |
| 0.8013888888888889 | 0 |
| 0.8020833333333334 | 0 |
| 0.8027777777777777 | 0 |
| 0.8034722222222223 | 0 |
| 0.8041666666666667 | 0 |
| 0.8048611111111111 | 0 |
| 0.8055555555555555 | 0 |
| 0.80625 | 0 |
| 0.8069444444444445 | 0 |
| 0.8076388888888889 | 0 |
| 0.8083333333333332 | 0 |
| 0.8090277777777778 | 0 |
| 0.8097222222222222 | 0 |
| 0.8104166666666667 | 0 |
| 0.811111111111111 | 0 |
| 0.8118055555555556 | 0 |
| 0.8125 | 0 |
| 0.8131944444444444 | 0 |
| 0.813888888888889 | 0 |
| 0.8145833333333333 | 0 |
| 0.8152777777777778 | 0 |
| 0.8159722222222222 | 0 |
| 0.8166666666666668 | 0 |
| 0.8173611111111111 | 0 |
| 0.8180555555555555 | 0 |
| 0.81875 | 0 |
| 0.8194444444444445 | 0 |
| 0.8201388888888889 | 0 |
| 0.8208333333333333 | 0 |
| 0.8215277777777777 | 0 |
| 0.8222222222222223 | 0 |
| 0.8229166666666666 | 0 |
| 0.8236111111111111 | 0 |
| 0.8243055555555556 | 0 |
| 0.8250000000000001 | 0 |
| 0.8256944444444444 | 0 |
| 0.8263888888888888 | 0 |
| 0.8270833333333334 | 0 |
| 0.8277777777777778 | 0 |
| 0.8284722222222222 | 0 |
| 0.8291666666666666 | 0 |
| 0.8298611111111112 | 0 |
| 0.8305555555555556 | 0 |
| 0.8312499999999999 | 0 |
| 0.8319444444444444 | 0 |
| 0.8326388888888889 | 0 |
| 0.8333333333333334 | 0 |
| 0.8340277777777777 | 0 |
| 0.8347222222222223 | 0 |
| 0.8354166666666667 | 0 |
| 0.8361111111111111 | 0 |
| 0.8368055555555555 | 0 |
| 0.8375 | 0 |
| 0.8381944444444445 | 0 |
| 0.8388888888888889 | 0 |
| 0.8395833333333332 | 0 |
| 0.8402777777777778 | 0 |
| 0.8409722222222222 | 0 |
| 0.8416666666666667 | 0 |
| 0.842361111111111 | 0 |
| 0.8430555555555556 | 0 |
| 0.84375 | 0 |
| 0.8444444444444444 | 0 |
| 0.845138888888889 | 0 |
| 0.8458333333333333 | 0 |
| 0.8465277777777778 | 0 |
| 0.8472222222222222 | 0 |
| 0.8479166666666668 | 0 |
| 0.8486111111111111 | 0 |
| 0.8493055555555555 | 0 |
| 0.85 | 0 |
| 0.8506944444444445 | 0 |
| 0.8513888888888889 | 0 |
| 0.8520833333333333 | 0 |
| 0.8527777777777777 | 0 |
| 0.8534722222222223 | 0 |
| 0.8541666666666666 | 0 |
| 0.8548611111111111 | 0 |
| 0.8555555555555556 | 0 |
| 0.8562500000000001 | 0 |
| 0.8569444444444444 | 0 |
| 0.8576388888888888 | 0 |
| 0.8583333333333334 | 0 |
| 0.8590277777777778 | 0 |
| 0.8597222222222222 | 0 |
| 0.8604166666666666 | 0 |
| 0.8611111111111112 | 0 |
| 0.8618055555555556 | 0 |
| 0.8624999999999999 | 0 |
| 0.8631944444444444 | 0 |
| 0.8638888888888889 | 0 |
| 0.8645833333333334 | 0 |
| 0.8652777777777777 | 0 |
| 0.8659722222222223 | 0 |
| 0.8666666666666667 | 0 |
| 0.8673611111111111 | 0 |
| 0.8680555555555555 | 0 |
| 0.86875 | 0 |
| 0.8694444444444445 | 0 |
| 0.8701388888888889 | 0 |
| 0.8708333333333332 | 0 |
| 0.8715277777777778 | 0 |
| 0.8722222222222222 | 0 |
| 0.8729166666666667 | 0 |
| 0.873611111111111 | 0 |
| 0.8743055555555556 | 0 |
| 0.875 | 0 |
| 0.8756944444444444 | 0 |
| 0.876388888888889 | 0 |
| 0.8770833333333333 | 0 |
| 0.8777777777777778 | 0 |
| 0.8784722222222222 | 0 |
| 0.8791666666666668 | 0 |
| 0.8798611111111111 | 0 |
| 0.8805555555555555 | 0 |
| 0.88125 | 0 |
| 0.8819444444444445 | 0 |
| 0.8826388888888889 | 0 |
| 0.8833333333333333 | 0 |
| 0.8840277777777777 | 0 |
| 0.8847222222222223 | 0 |
| 0.8854166666666666 | 0 |
| 0.8861111111111111 | 0 |
| 0.8868055555555556 | 0 |
| 0.8875000000000001 | 0 |
| 0.8881944444444444 | 0 |
| 0.8888888888888888 | 0 |
| 0.8895833333333334 | 0 |
| 0.8902777777777778 | 0 |
| 0.8909722222222222 | 0 |
| 0.8916666666666666 | 0 |
| 0.8923611111111112 | 0 |
| 0.8930555555555556 | 0 |
| 0.8937499999999999 | 0 |
| 0.8944444444444444 | 0 |
| 0.8951388888888889 | 0 |
| 0.8958333333333334 | 0 |
| 0.8965277777777777 | 0 |
| 0.8972222222222223 | 0 |
| 0.8979166666666667 | 0 |
| 0.8986111111111111 | 0 |
| 0.8993055555555555 | 0 |
| 0.9 | 0 |
| 0.9006944444444445 | 0 |
| 0.9013888888888889 | 0 |
| 0.9020833333333332 | 0 |
| 0.9027777777777778 | 0 |
| 0.9034722222222222 | 0 |
| 0.9041666666666667 | 0 |
| 0.904861111111111 | 0 |
| 0.9055555555555556 | 0 |
| 0.90625 | 0 |
| 0.9069444444444444 | 0 |
| 0.907638888888889 | 0 |
| 0.9083333333333333 | 0 |
| 0.9090277777777778 | 0 |
| 0.9097222222222222 | 0 |
| 0.9104166666666668 | 0 |
| 0.9111111111111111 | 0 |
| 0.9118055555555555 | 0 |
| 0.9125 | 0 |
| 0.9131944444444445 | 0 |
| 0.9138888888888889 | 0 |
| 0.9145833333333333 | 0 |
| 0.9152777777777777 | 0 |
| 0.9159722222222223 | 0 |
| 0.9166666666666666 | 0 |
| 0.9173611111111111 | 0 |
| 0.9180555555555556 | 0 |
| 0.9187500000000001 | 0 |
| 0.9194444444444444 | 0 |
| 0.9201388888888888 | 0 |
| 0.9208333333333334 | 0 |
| 0.9215277777777778 | 0 |
| 0.9222222222222222 | 0 |
| 0.9229166666666666 | 0 |
| 0.9236111111111112 | 0 |
| 0.9243055555555556 | 0 |
| 0.9249999999999999 | 0 |
| 0.9256944444444444 | 0 |
| 0.9263888888888889 | 0 |
| 0.9270833333333334 | 0 |
| 0.9277777777777777 | 0 |
| 0.9284722222222223 | 0 |
| 0.9291666666666667 | 0 |
| 0.9298611111111111 | 0 |
| 0.9305555555555555 | 0 |
| 0.93125 | 0 |
| 0.9319444444444445 | 0 |
| 0.9326388888888889 | 0 |
| 0.9333333333333332 | 0 |
| 0.9340277777777778 | 0 |
| 0.9347222222222222 | 0 |
| 0.9354166666666667 | 0 |
| 0.936111111111111 | 0 |
| 0.9368055555555556 | 0 |
| 0.9375 | 0 |
| 0.9381944444444444 | 0 |
| 0.938888888888889 | 0 |
| 0.9395833333333333 | 0 |
| 0.9402777777777778 | 0 |
| 0.9409722222222222 | 0 |
| 0.9416666666666668 | 0 |
| 0.9423611111111111 | 0 |
| 0.9430555555555555 | 0 |
| 0.94375 | 0 |
| 0.9444444444444445 | 0 |
| 0.9451388888888889 | 0 |
| 0.9458333333333333 | 0 |
| 0.9465277777777777 | 0 |
| 0.9472222222222223 | 0 |
| 0.9479166666666666 | 0 |
| 0.9486111111111111 | 0 |
| 0.9493055555555556 | 0 |
| 0.9500000000000001 | 0 |
| 0.9506944444444444 | 0 |
| 0.9513888888888888 | 0 |
| 0.9520833333333334 | 0 |
| 0.9527777777777778 | 0 |
| 0.9534722222222222 | 0 |
| 0.9541666666666666 | 0 |
| 0.9548611111111112 | 0 |
| 0.9555555555555556 | 0 |
| 0.9562499999999999 | 0 |
| 0.9569444444444444 | 0 |
| 0.9576388888888889 | 0 |
| 0.9583333333333334 | 0 |
| 0.9590277777777777 | 0 |
| 0.9597222222222223 | 0 |
| 0.9604166666666667 | 0 |
| 0.9611111111111111 | 0 |
| 0.9618055555555555 | 0 |
| 0.9625 | 0 |
| 0.9631944444444445 | 0 |
| 0.9638888888888889 | 0 |
| 0.9645833333333332 | 0 |
| 0.9652777777777778 | 0 |
| 0.9659722222222222 | 0 |
| 0.9666666666666667 | 0 |
| 0.967361111111111 | 0 |
| 0.9680555555555556 | 0 |
| 0.96875 | 0 |
| 0.9694444444444444 | 0 |
| 0.970138888888889 | 0 |
| 0.9708333333333333 | 0 |
| 0.9715277777777778 | 0 |
| 0.9722222222222222 | 0 |
| 0.9729166666666668 | 0 |
| 0.9736111111111111 | 0 |
| 0.9743055555555555 | 0 |
| 0.975 | 0 |
| 0.9756944444444445 | 0 |
| 0.9763888888888889 | 0 |
| 0.9770833333333333 | 0 |
| 0.9777777777777777 | 0 |
| 0.9784722222222223 | 0 |
| 0.9791666666666666 | 0 |
| 0.9798611111111111 | 0 |
| 0.9805555555555556 | 0 |
| 0.9812500000000001 | 0 |
| 0.9819444444444444 | 0 |
| 0.9826388888888888 | 0 |
| 0.9833333333333334 | 0 |
| 0.9840277777777778 | 0 |
| 0.9847222222222222 | 0 |
| 0.9854166666666666 | 0 |
| 0.9861111111111112 | 0 |
| 0.9868055555555556 | 0 |
| 0.9874999999999999 | 0 |
| 0.9881944444444444 | 0 |
| 0.9888888888888889 | 0 |
| 0.9895833333333334 | 0 |
| 0.9902777777777777 | 0 |
| 0.9909722222222223 | 0 |
| 0.9916666666666667 | 0 |
| 0.9923611111111111 | 0 |
| 0.9930555555555555 | 0 |
| 0.99375 | 0 |
| 0.9944444444444445 | 0 |
| 0.9951388888888889 | 0 |
| 0.9958333333333332 | 0 |
| 0.9965277777777778 | 0 |
| 0.9972222222222222 | 0 |
| 0.9979166666666667 | 0 |
| 0.998611111111111 | 0 |
| 0.9993055555555556 | 0 |